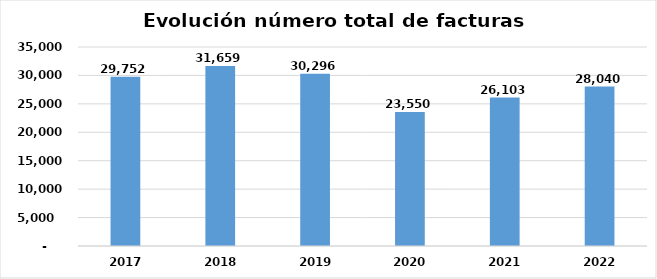
| Category | Número total de facturas |
|---|---|
| 2017.0 | 29752 |
| 2018.0 | 31659 |
| 2019.0 | 30296 |
| 2020.0 | 23550 |
| 2021.0 | 26103 |
| 2022.0 | 28040 |